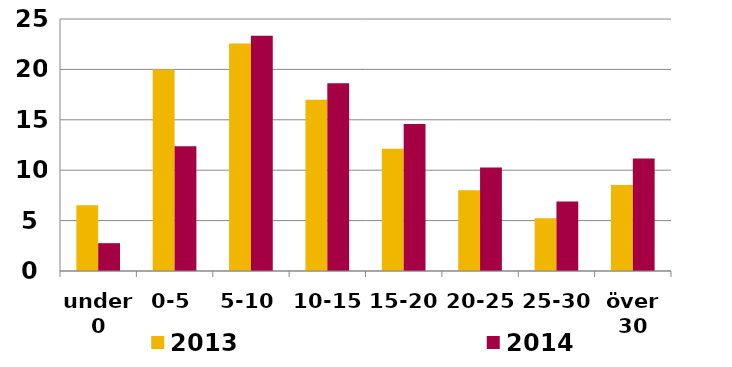
| Category | 2013 | 2014 |
|---|---|---|
| under 0 | 6.516 | 2.759 |
| 0-5 | 19.995 | 12.374 |
| 5-10 | 22.579 | 23.335 |
| 10-15 | 16.989 | 18.617 |
| 15-20 | 12.136 | 14.586 |
| 20-25 | 8.011 | 10.269 |
| 25-30 | 5.244 | 6.907 |
| över 30 | 8.53 | 11.153 |